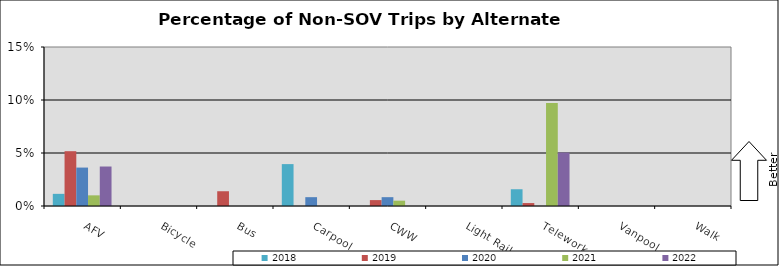
| Category | 2018 | 2019 | 2020 | 2021 | 2022 |
|---|---|---|---|---|---|
| AFV | 0.011 | 0.052 | 0.036 | 0.01 | 0.037 |
| Bicycle | 0 | 0 | 0 | 0 | 0 |
| Bus | 0 | 0.014 | 0 | 0 | 0 |
| Carpool | 0.04 | 0 | 0.008 | 0 | 0 |
| CWW | 0 | 0.006 | 0.008 | 0.005 | 0 |
| Light Rail | 0 | 0 | 0 | 0 | 0 |
| Telework | 0.016 | 0.003 | 0 | 0.097 | 0.05 |
| Vanpool | 0 | 0 | 0 | 0 | 0 |
| Walk | 0 | 0 | 0 | 0 | 0 |